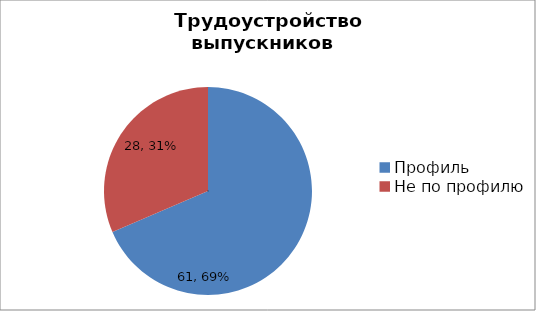
| Category | 2017 г. |
|---|---|
| Профиль | 61 |
| Не по профилю | 28 |